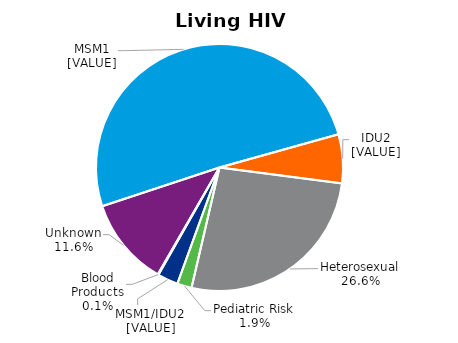
| Category | Living HIV Cases |
|---|---|
| Unknown | 0.116 |
| MSM | 0.508 |
| IDU | 0.064 |
| Heterosexual | 0.266 |
| Pediatric Risk | 0.019 |
| MSM  /IDU   | 0.027 |
| Blood Products | 0.001 |